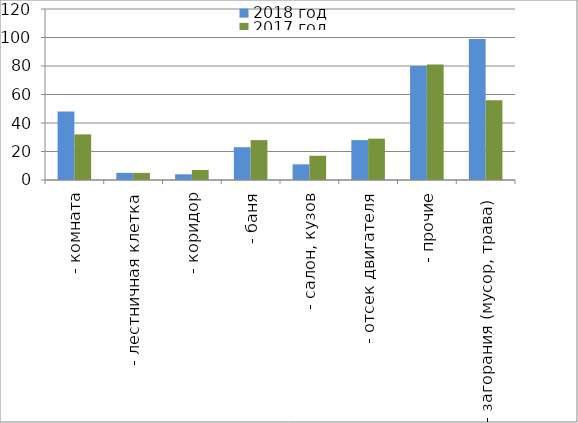
| Category | 2018 год | 2017 год |
|---|---|---|
|  - комната | 48 | 32 |
|  - лестничная клетка | 5 | 5 |
|  - коридор | 4 | 7 |
|  - баня | 23 | 28 |
|  - салон, кузов | 11 | 17 |
|  - отсек двигателя | 28 | 29 |
| - прочие | 80 | 81 |
| - загорания (мусор, трава)  | 99 | 56 |